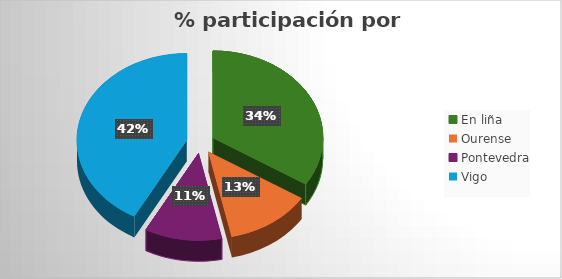
| Category | Asistentes |
|---|---|
| En liña | 105 |
| Ourense | 39 |
| Pontevedra | 35 |
| Vigo | 130 |